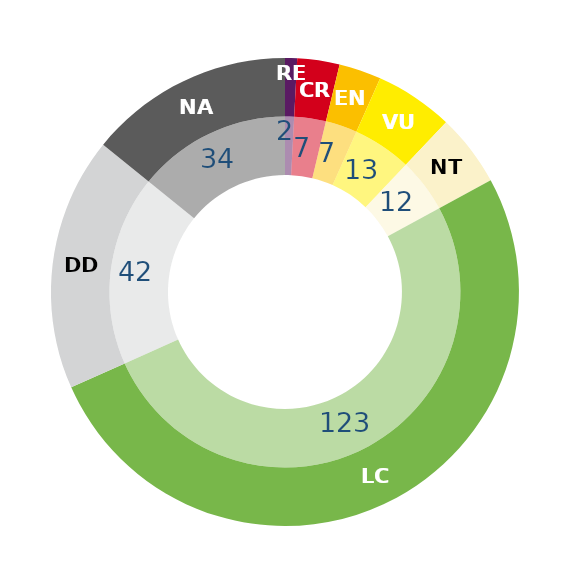
| Category | Series 1 | Series 0 |
|---|---|---|
| RE | 2 | 2 |
| CR | 7 | 7 |
| EN | 7 | 7 |
| VU | 13 | 13 |
| NT | 12 | 12 |
| LC | 123 | 123 |
| DD | 42 | 42 |
| NA | 34 | 34 |